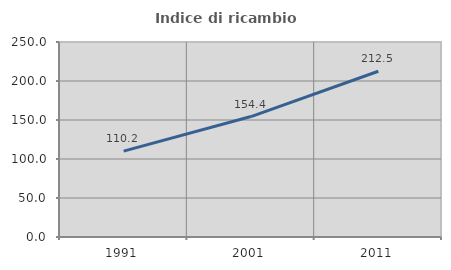
| Category | Indice di ricambio occupazionale  |
|---|---|
| 1991.0 | 110.16 |
| 2001.0 | 154.413 |
| 2011.0 | 212.518 |